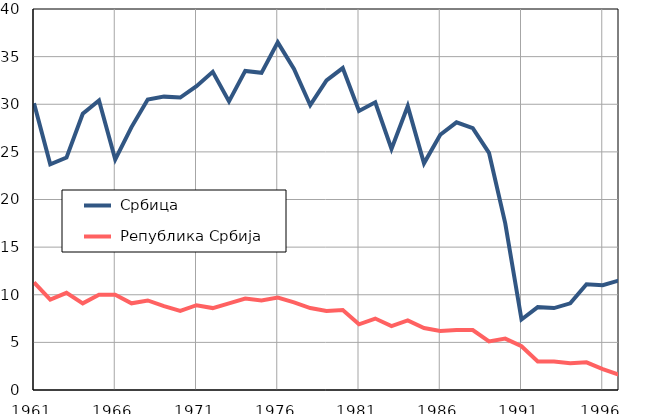
| Category |  Србица |  Република Србија |
|---|---|---|
| 1961.0 | 30.1 | 11.3 |
| 1962.0 | 23.7 | 9.5 |
| 1963.0 | 24.4 | 10.2 |
| 1964.0 | 29 | 9.1 |
| 1965.0 | 30.4 | 10 |
| 1966.0 | 24.2 | 10 |
| 1967.0 | 27.6 | 9.1 |
| 1968.0 | 30.5 | 9.4 |
| 1969.0 | 30.8 | 8.8 |
| 1970.0 | 30.7 | 8.3 |
| 1971.0 | 31.9 | 8.9 |
| 1972.0 | 33.4 | 8.6 |
| 1973.0 | 30.3 | 9.1 |
| 1974.0 | 33.5 | 9.6 |
| 1975.0 | 33.3 | 9.4 |
| 1976.0 | 36.5 | 9.7 |
| 1977.0 | 33.7 | 9.2 |
| 1978.0 | 29.9 | 8.6 |
| 1979.0 | 32.5 | 8.3 |
| 1980.0 | 33.8 | 8.4 |
| 1981.0 | 29.3 | 6.9 |
| 1982.0 | 30.2 | 7.5 |
| 1983.0 | 25.3 | 6.7 |
| 1984.0 | 29.8 | 7.3 |
| 1985.0 | 23.8 | 6.5 |
| 1986.0 | 26.8 | 6.2 |
| 1987.0 | 28.1 | 6.3 |
| 1988.0 | 27.5 | 6.3 |
| 1989.0 | 24.9 | 5.1 |
| 1990.0 | 17.5 | 5.4 |
| 1991.0 | 7.4 | 4.6 |
| 1992.0 | 8.7 | 3 |
| 1993.0 | 8.6 | 3 |
| 1994.0 | 9.1 | 2.8 |
| 1995.0 | 11.1 | 2.9 |
| 1996.0 | 11 | 2.2 |
| 1997.0 | 11.5 | 1.6 |